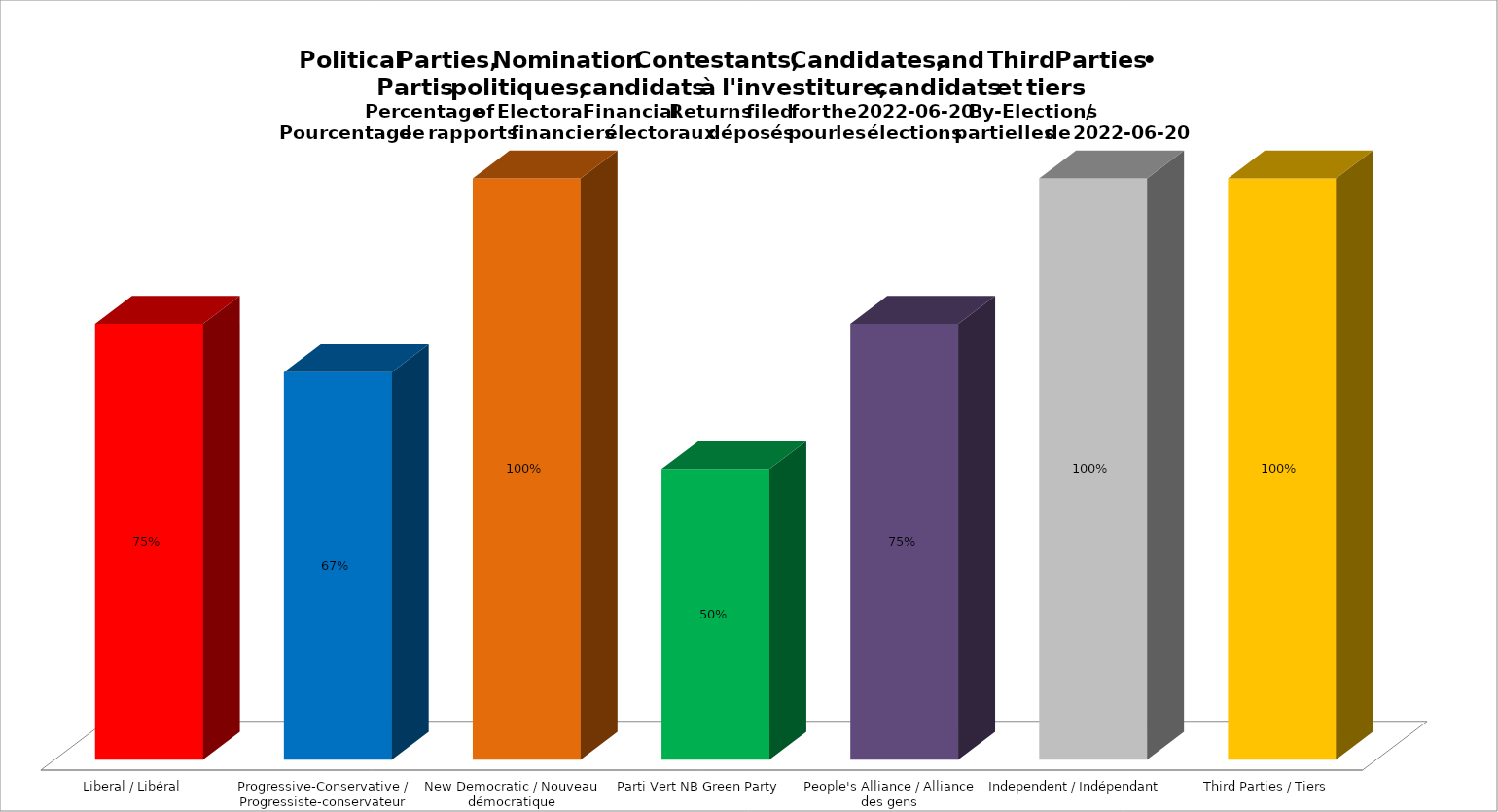
| Category | Series 0 | Series 2 | Series 4 |
|---|---|---|---|
| Liberal / Libéral | 0.75 |  |  |
| Progressive-Conservative / Progressiste-conservateur | 0.667 |  |  |
| New Democratic / Nouveau démocratique | 1 |  |  |
| Parti Vert NB Green Party | 0.5 |  |  |
| People's Alliance / Alliance des gens | 0.75 |  |  |
| Independent / Indépendant | 1 |  |  |
| Third Parties / Tiers | 1 |  |  |